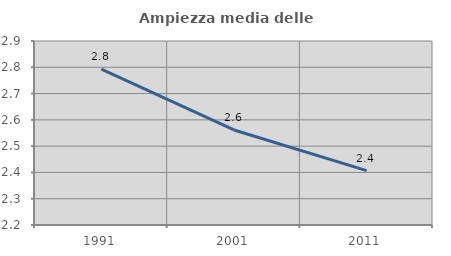
| Category | Ampiezza media delle famiglie |
|---|---|
| 1991.0 | 2.793 |
| 2001.0 | 2.562 |
| 2011.0 | 2.407 |